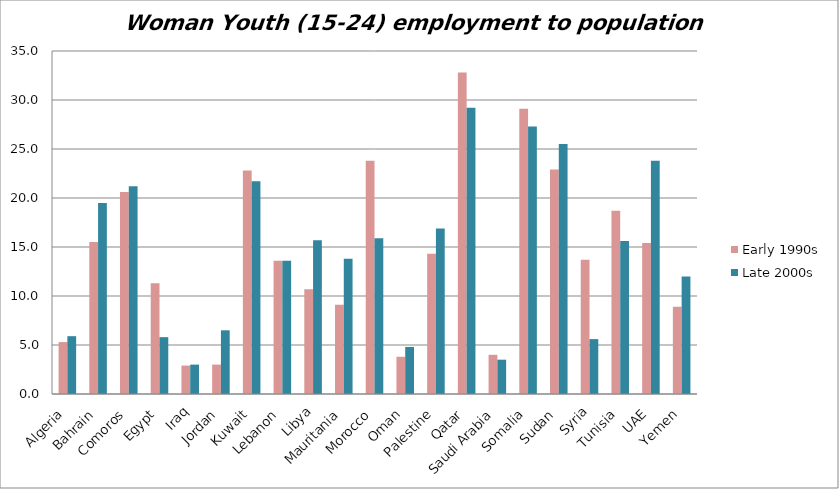
| Category | Early 1990s | Late 2000s |
|---|---|---|
| Algeria | 5.3 | 5.9 |
| Bahrain | 15.5 | 19.5 |
| Comoros | 20.6 | 21.2 |
| Egypt | 11.3 | 5.8 |
| Iraq | 2.9 | 3 |
| Jordan | 3 | 6.5 |
| Kuwait | 22.8 | 21.7 |
| Lebanon | 13.6 | 13.6 |
| Libya | 10.7 | 15.7 |
| Mauritania | 9.1 | 13.8 |
| Morocco | 23.8 | 15.9 |
| Oman | 3.8 | 4.8 |
| Palestine | 14.3 | 16.9 |
| Qatar | 32.8 | 29.2 |
| Saudi Arabia | 4 | 3.5 |
| Somalia | 29.1 | 27.3 |
| Sudan | 22.9 | 25.5 |
| Syria | 13.7 | 5.6 |
| Tunisia | 18.7 | 15.6 |
| UAE | 15.4 | 23.8 |
| Yemen | 8.9 | 12 |